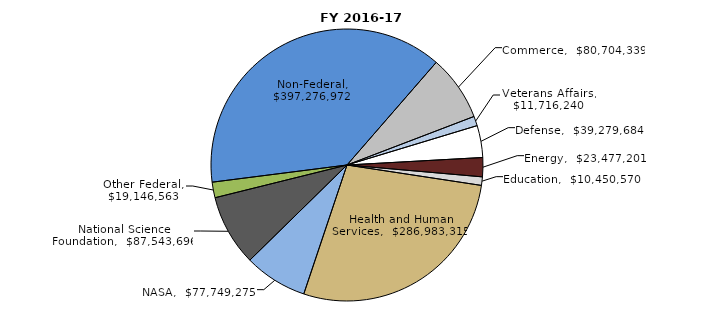
| Category | Series 0 |
|---|---|
| Commerce | 80704339 |
| Veterans Affairs | 11716240 |
| Defense | 39279684 |
| Energy | 23477201 |
| Education | 10450570 |
| Health and Human Services | 286983315 |
| NASA | 77749275 |
| National Science Foundation | 87543696 |
| Other Federal | 19146563 |
| Non-Federal | 397276972 |